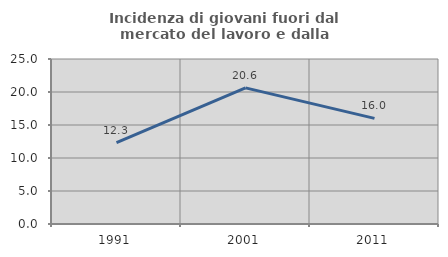
| Category | Incidenza di giovani fuori dal mercato del lavoro e dalla formazione  |
|---|---|
| 1991.0 | 12.344 |
| 2001.0 | 20.631 |
| 2011.0 | 16.005 |